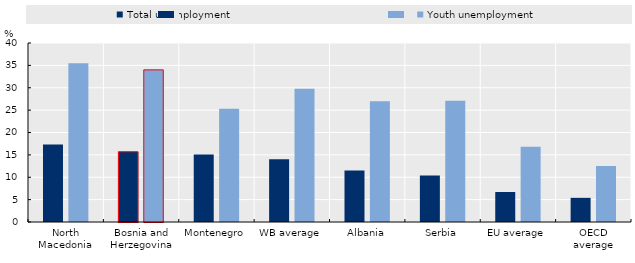
| Category | Total unemployment | Youth unemployment |
|---|---|---|
| North Macedonia | 17.3 | 35.5 |
| Bosnia and Herzegovina | 15.7 | 34 |
| Montenegro | 15.1 | 25.3 |
| WB average | 14 | 29.78 |
| Albania | 11.5 | 27 |
| Serbia | 10.4 | 27.1 |
| EU average | 6.7 | 16.8 |
| OECD average | 5.4 | 12.5 |